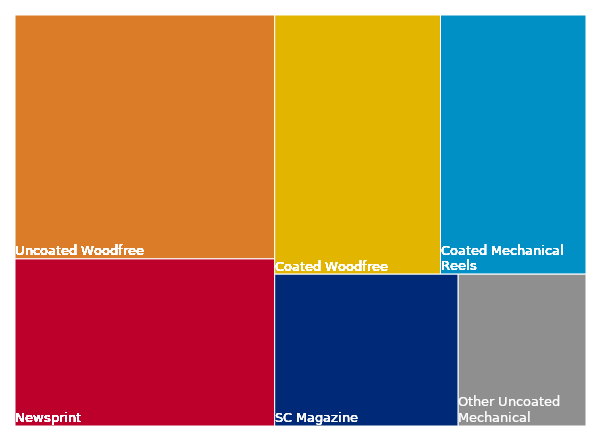
| Category | Graphic paper |
|---|---|
| 2019/10 | 2127 |
| 2019/11 | 2008 |
| 2019/12 | 1740 |
| 2020/01 | 1931 |
| 2020/02 | 1824 |
| 2020/03 | 1859 |
| 2020/04 | 1347 |
| 2020/05 | 1228 |
| 2020/06 | 1340 |
| 2020/07 | 1497 |
| 2020/08 | 1486 |
| 2020/09 | 1691 |
| 2020/10 | 1770 |
| 2020/11 | 1699 |
| 2020/12 | 1882 |
| 2021/01 | 1504 |
| 2021/02 | 1553 |
| 2021/03 | 1772 |
| 2021/04 | 1561 |
| 2021/05 | 1579 |
| 2021/06 | 1705 |
| 2021/07 | 1574 |
| 2021/08 | 1628 |
| 2021/09 | 1738 |
| 2021/10 | 1693 |